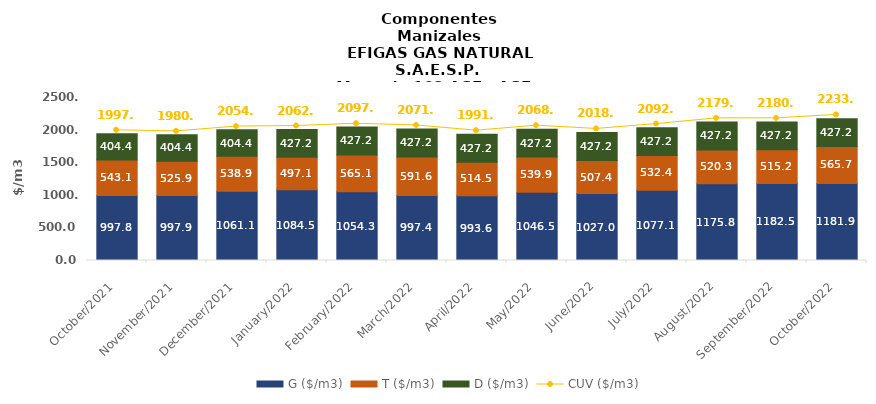
| Category | G ($/m3) | T ($/m3) | D ($/m3) |
|---|---|---|---|
| 2021-10-01 | 997.81 | 543.11 | 404.43 |
| 2021-11-01 | 997.89 | 525.94 | 404.43 |
| 2021-12-01 | 1061.07 | 538.86 | 404.43 |
| 2022-01-01 | 1084.54 | 497.14 | 427.16 |
| 2022-02-01 | 1054.28 | 565.07 | 427.16 |
| 2022-03-01 | 997.39 | 591.64 | 427.16 |
| 2022-04-01 | 993.58 | 514.51 | 427.16 |
| 2022-05-01 | 1046.51 | 539.86 | 427.16 |
| 2022-06-01 | 1026.97 | 507.37 | 427.16 |
| 2022-07-01 | 1077.11 | 532.44 | 427.16 |
| 2022-08-01 | 1175.82 | 520.33 | 427.16 |
| 2022-09-01 | 1182.5 | 515.15 | 427.16 |
| 2022-10-01 | 1181.88 | 565.72 | 427.16 |